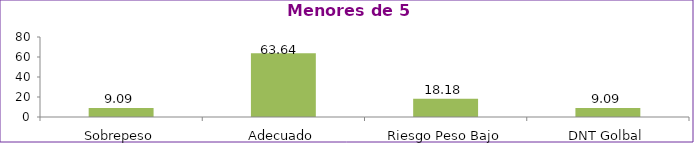
| Category | Series 0 |
|---|---|
| Sobrepeso | 9.09 |
| Adecuado | 63.64 |
| Riesgo Peso Bajo | 18.18 |
| DNT Golbal | 9.09 |